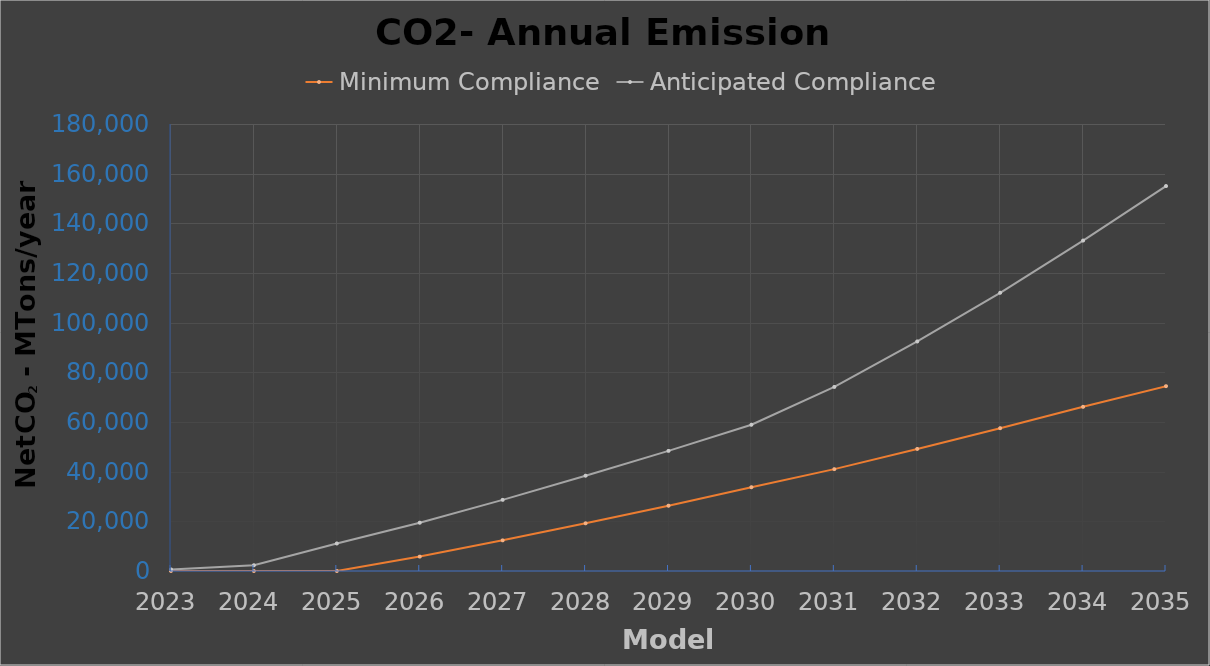
| Category | Minimum Compliance | Anticipated Compliance |
|---|---|---|
| 2023.0 | 0 | 641.094 |
| 2024.0 | 0 | 2310.424 |
| 2025.0 | 0 | 11085.876 |
| 2026.0 | 5797.132 | 19442.837 |
| 2027.0 | 12342.461 | 28647.208 |
| 2028.0 | 19213.622 | 38370.643 |
| 2029.0 | 26282.855 | 48365.461 |
| 2030.0 | 33738.786 | 58892.356 |
| 2031.0 | 41013.217 | 74119.975 |
| 2032.0 | 49160.992 | 92426.206 |
| 2033.0 | 57514.323 | 112038.624 |
| 2034.0 | 66106.994 | 133070.622 |
| 2035.0 | 74432.822 | 155013.891 |